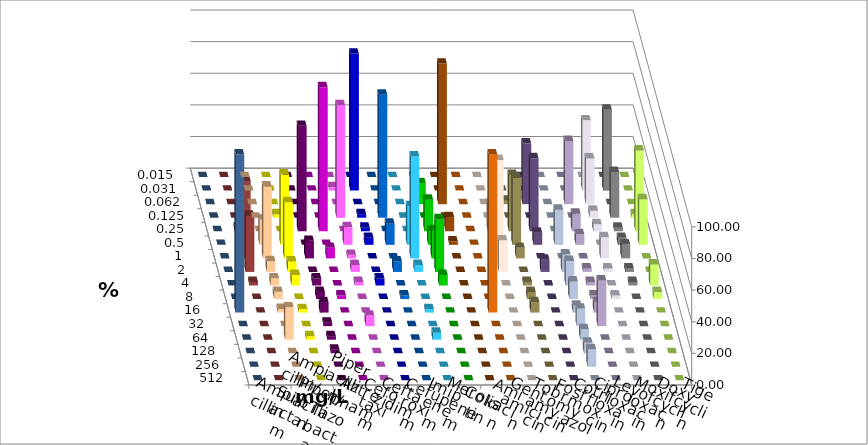
| Category | Ampicillin | Ampicillin/ Sulbactam | Piperacillin | Piperacillin/ Tazobactam | Aztreonam | Cefotaxim | Ceftazidim | Cefuroxim | Imipenem | Meropenem | Colistin | Amikacin | Gentamicin | Tobramycin | Fosfomycin | Cotrimoxazol | Ciprofloxacin | Levofloxacin | Moxifloxacin | Doxycyclin | Tigecyclin |
|---|---|---|---|---|---|---|---|---|---|---|---|---|---|---|---|---|---|---|---|---|---|
| 0.015 | 0 | 0 | 0 | 0 | 0 | 0 | 0 | 0 | 0 | 0 | 0 | 0 | 0 | 0 | 0 | 0 | 0 | 0 | 0 | 0 | 0 |
| 0.031 | 0 | 0 | 0 | 0 | 2.222 | 86.667 | 0 | 0 | 0 | 0 | 0 | 0 | 0 | 0 | 0 | 0 | 44.444 | 51.111 | 0 | 0 | 0 |
| 0.062 | 0 | 0 | 0 | 0 | 0 | 0 | 0 | 0 | 13.333 | 88.889 | 0 | 0 | 2.222 | 38.462 | 0 | 40 | 28.889 | 0 | 0 | 0 | 0 |
| 0.125 | 0 | 2.222 | 0 | 0 | 71.111 | 2.222 | 77.778 | 0 | 0 | 0 | 0 | 0 | 0 | 0 | 0 | 0 | 4.444 | 28.889 | 2.222 | 0 | 0 |
| 0.25 | 0 | 0 | 66.667 | 91.111 | 0 | 2.222 | 0 | 0 | 20 | 8.889 | 0 | 17.778 | 35.556 | 46.154 | 0 | 11.111 | 4.444 | 2.222 | 51.111 | 0 | 2.222 |
| 0.5 | 15.909 | 44.444 | 0 | 0 | 11.111 | 4.444 | 13.333 | 24.444 | 8.889 | 2.222 | 0 | 0 | 42.222 | 7.692 | 22.222 | 6.667 | 0 | 4.444 | 28.889 | 0 | 11.111 |
| 1.0 | 45.455 | 35.556 | 11.111 | 6.667 | 2.222 | 0 | 0 | 64.444 | 17.778 | 0 | 0 | 62.222 | 6.667 | 0 | 0 | 0 | 13.333 | 8.889 | 0 | 0 | 48.889 |
| 2.0 | 6.818 | 6.667 | 0 | 0 | 4.444 | 0 | 6.667 | 4.444 | 33.333 | 0 | 0 | 20 | 0 | 7.692 | 11.111 | 2.222 | 2.222 | 2.222 | 0 | 0 | 35.556 |
| 4.0 | 4.545 | 6.667 | 4.444 | 0 | 2.222 | 4.444 | 0 | 0 | 6.667 | 0 | 0 | 0 | 2.222 | 0 | 15.556 | 2.222 | 0 | 2.222 | 13.333 | 0 | 2.222 |
| 8.0 | 4.545 | 0 | 4.444 | 2.222 | 0 | 0 | 2.222 | 0 | 0 | 0 | 0 | 0 | 4.444 | 0 | 11.111 | 2.222 | 2.222 | 0 | 4.444 | 0 | 0 |
| 16.0 | 2.273 | 2.222 | 6.667 | 0 | 0 | 0 | 0 | 2.222 | 0 | 0 | 100 | 0 | 6.667 | 0 | 4.444 | 6.667 | 0 | 0 | 0 | 100 | 0 |
| 32.0 | 0 | 0 | 2.222 | 0 | 6.667 | 0 | 0 | 0 | 0 | 0 | 0 | 0 | 0 | 0 | 11.111 | 28.889 | 0 | 0 | 0 | 0 | 0 |
| 64.0 | 20.455 | 2.222 | 2.222 | 0 | 0 | 0 | 0 | 4.444 | 0 | 0 | 0 | 0 | 0 | 0 | 6.667 | 0 | 0 | 0 | 0 | 0 | 0 |
| 128.0 | 0 | 0 | 2.222 | 0 | 0 | 0 | 0 | 0 | 0 | 0 | 0 | 0 | 0 | 0 | 6.667 | 0 | 0 | 0 | 0 | 0 | 0 |
| 256.0 | 0 | 0 | 0 | 0 | 0 | 0 | 0 | 0 | 0 | 0 | 0 | 0 | 0 | 0 | 11.111 | 0 | 0 | 0 | 0 | 0 | 0 |
| 512.0 | 0 | 0 | 0 | 0 | 0 | 0 | 0 | 0 | 0 | 0 | 0 | 0 | 0 | 0 | 0 | 0 | 0 | 0 | 0 | 0 | 0 |